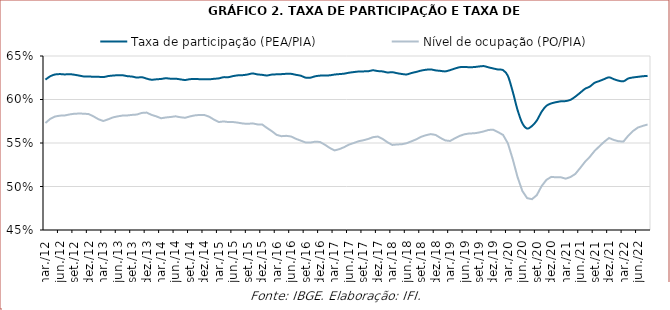
| Category | Taxa de participação (PEA/PIA) | Nível de ocupação (PO/PIA) |
|---|---|---|
| 2012-03-01 | 0.623 | 0.573 |
| 2012-04-01 | 0.627 | 0.578 |
| 2012-05-01 | 0.629 | 0.58 |
| 2012-06-01 | 0.629 | 0.581 |
| 2012-07-01 | 0.629 | 0.582 |
| 2012-08-01 | 0.629 | 0.583 |
| 2012-09-01 | 0.628 | 0.584 |
| 2012-10-01 | 0.628 | 0.584 |
| 2012-11-01 | 0.626 | 0.584 |
| 2012-12-01 | 0.627 | 0.583 |
| 2013-01-01 | 0.626 | 0.581 |
| 2013-02-01 | 0.626 | 0.577 |
| 2013-03-01 | 0.626 | 0.575 |
| 2013-04-01 | 0.627 | 0.577 |
| 2013-05-01 | 0.628 | 0.579 |
| 2013-06-01 | 0.628 | 0.581 |
| 2013-07-01 | 0.628 | 0.582 |
| 2013-08-01 | 0.627 | 0.582 |
| 2013-09-01 | 0.626 | 0.582 |
| 2013-10-01 | 0.625 | 0.583 |
| 2013-11-01 | 0.626 | 0.585 |
| 2013-12-01 | 0.624 | 0.585 |
| 2014-01-01 | 0.623 | 0.582 |
| 2014-02-01 | 0.623 | 0.581 |
| 2014-03-01 | 0.624 | 0.578 |
| 2014-04-01 | 0.624 | 0.579 |
| 2014-05-01 | 0.624 | 0.58 |
| 2014-06-01 | 0.624 | 0.581 |
| 2014-07-01 | 0.623 | 0.58 |
| 2014-08-01 | 0.622 | 0.579 |
| 2014-09-01 | 0.623 | 0.581 |
| 2014-10-01 | 0.624 | 0.582 |
| 2014-11-01 | 0.623 | 0.582 |
| 2014-12-01 | 0.623 | 0.582 |
| 2015-01-01 | 0.623 | 0.58 |
| 2015-02-01 | 0.624 | 0.577 |
| 2015-03-01 | 0.624 | 0.574 |
| 2015-04-01 | 0.626 | 0.575 |
| 2015-05-01 | 0.626 | 0.574 |
| 2015-06-01 | 0.627 | 0.574 |
| 2015-07-01 | 0.628 | 0.573 |
| 2015-08-01 | 0.628 | 0.572 |
| 2015-09-01 | 0.629 | 0.572 |
| 2015-10-01 | 0.63 | 0.573 |
| 2015-11-01 | 0.629 | 0.571 |
| 2015-12-01 | 0.628 | 0.571 |
| 2016-01-01 | 0.628 | 0.567 |
| 2016-02-01 | 0.629 | 0.564 |
| 2016-03-01 | 0.629 | 0.559 |
| 2016-04-01 | 0.629 | 0.558 |
| 2016-05-01 | 0.63 | 0.558 |
| 2016-06-01 | 0.63 | 0.557 |
| 2016-07-01 | 0.628 | 0.555 |
| 2016-08-01 | 0.627 | 0.553 |
| 2016-09-01 | 0.625 | 0.551 |
| 2016-10-01 | 0.625 | 0.55 |
| 2016-11-01 | 0.627 | 0.552 |
| 2016-12-01 | 0.627 | 0.551 |
| 2017-01-01 | 0.628 | 0.548 |
| 2017-02-01 | 0.628 | 0.544 |
| 2017-03-01 | 0.629 | 0.541 |
| 2017-04-01 | 0.629 | 0.543 |
| 2017-05-01 | 0.63 | 0.545 |
| 2017-06-01 | 0.631 | 0.548 |
| 2017-07-01 | 0.632 | 0.55 |
| 2017-08-01 | 0.632 | 0.552 |
| 2017-09-01 | 0.632 | 0.553 |
| 2017-10-01 | 0.632 | 0.555 |
| 2017-11-01 | 0.634 | 0.557 |
| 2017-12-01 | 0.633 | 0.557 |
| 2018-01-01 | 0.632 | 0.555 |
| 2018-02-01 | 0.631 | 0.551 |
| 2018-03-01 | 0.631 | 0.548 |
| 2018-04-01 | 0.63 | 0.548 |
| 2018-05-01 | 0.629 | 0.549 |
| 2018-06-01 | 0.629 | 0.55 |
| 2018-07-01 | 0.63 | 0.552 |
| 2018-08-01 | 0.632 | 0.554 |
| 2018-09-01 | 0.633 | 0.557 |
| 2018-10-01 | 0.634 | 0.559 |
| 2018-11-01 | 0.635 | 0.56 |
| 2018-12-01 | 0.633 | 0.559 |
| 2019-01-01 | 0.633 | 0.556 |
| 2019-02-01 | 0.632 | 0.553 |
| 2019-03-01 | 0.634 | 0.552 |
| 2019-04-01 | 0.636 | 0.555 |
| 2019-05-01 | 0.637 | 0.558 |
| 2019-06-01 | 0.637 | 0.56 |
| 2019-07-01 | 0.637 | 0.561 |
| 2019-08-01 | 0.637 | 0.561 |
| 2019-09-01 | 0.638 | 0.562 |
| 2019-10-01 | 0.638 | 0.563 |
| 2019-11-01 | 0.637 | 0.565 |
| 2019-12-01 | 0.636 | 0.565 |
| 2020-01-01 | 0.634 | 0.562 |
| 2020-02-01 | 0.634 | 0.559 |
| 2020-03-01 | 0.627 | 0.55 |
| 2020-04-01 | 0.609 | 0.532 |
| 2020-05-01 | 0.588 | 0.511 |
| 2020-06-01 | 0.573 | 0.495 |
| 2020-07-01 | 0.567 | 0.487 |
| 2020-08-01 | 0.57 | 0.485 |
| 2020-09-01 | 0.576 | 0.49 |
| 2020-10-01 | 0.586 | 0.5 |
| 2020-11-01 | 0.593 | 0.508 |
| 2020-12-01 | 0.595 | 0.511 |
| 2021-01-01 | 0.597 | 0.511 |
| 2021-02-01 | 0.598 | 0.511 |
| 2021-03-01 | 0.598 | 0.509 |
| 2021-04-01 | 0.6 | 0.511 |
| 2021-05-01 | 0.603 | 0.514 |
| 2021-06-01 | 0.608 | 0.521 |
| 2021-07-01 | 0.612 | 0.528 |
| 2021-08-01 | 0.615 | 0.534 |
| 2021-09-01 | 0.619 | 0.541 |
| 2021-10-01 | 0.621 | 0.546 |
| 2021-11-01 | 0.623 | 0.551 |
| 2021-12-01 | 0.625 | 0.556 |
| 2022-01-01 | 0.623 | 0.553 |
| 2022-02-01 | 0.622 | 0.552 |
| 2022-03-01 | 0.621 | 0.552 |
| 2022-04-01 | 0.624 | 0.558 |
| 2022-05-01 | 0.625 | 0.564 |
| 2022-06-01 | 0.626 | 0.568 |
| 2022-07-01 | 0.627 | 0.57 |
| 2022-08-01 | 0.627 | 0.571 |